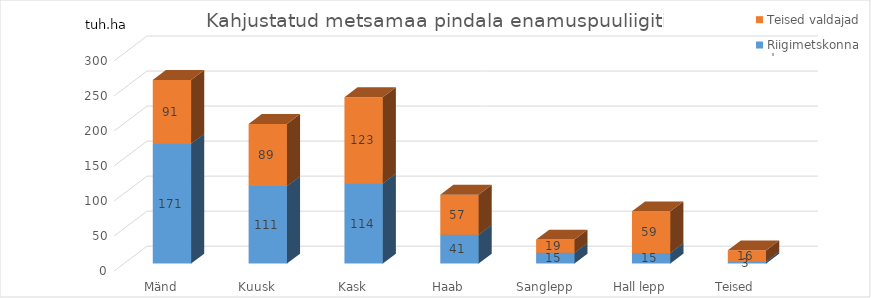
| Category | Riigimetskonnad | Teised valdajad |
|---|---|---|
| Mänd | 171.192 | 90.775 |
| Kuusk | 110.522 | 88.84 |
| Kask | 114.198 | 123.176 |
| Haab | 41.096 | 57.163 |
| Sanglepp | 15.426 | 18.791 |
| Hall lepp | 15.111 | 59.371 |
| Teised | 2.886 | 15.959 |